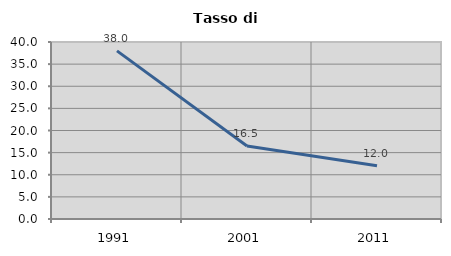
| Category | Tasso di disoccupazione   |
|---|---|
| 1991.0 | 37.995 |
| 2001.0 | 16.498 |
| 2011.0 | 12.017 |